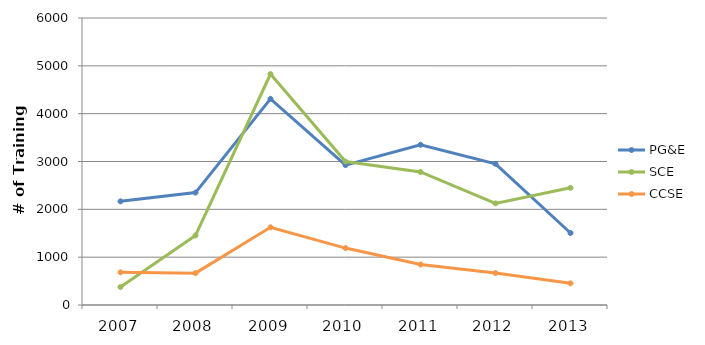
| Category | PG&E | SCE | CCSE |
|---|---|---|---|
| 2007.0 | 2167 | 376 | 684 |
| 2008.0 | 2350 | 1455 | 666 |
| 2009.0 | 4310 | 4827 | 1624 |
| 2010.0 | 2925 | 2999 | 1190 |
| 2011.0 | 3350 | 2781 | 847 |
| 2012.0 | 2951 | 2124 | 669 |
| 2013.0 | 1505 | 2450 | 453 |